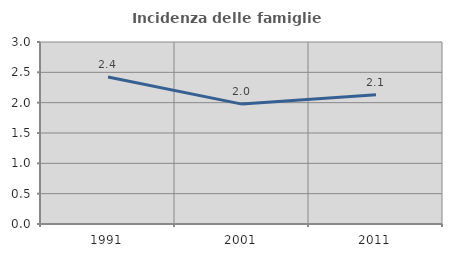
| Category | Incidenza delle famiglie numerose |
|---|---|
| 1991.0 | 2.424 |
| 2001.0 | 1.976 |
| 2011.0 | 2.132 |